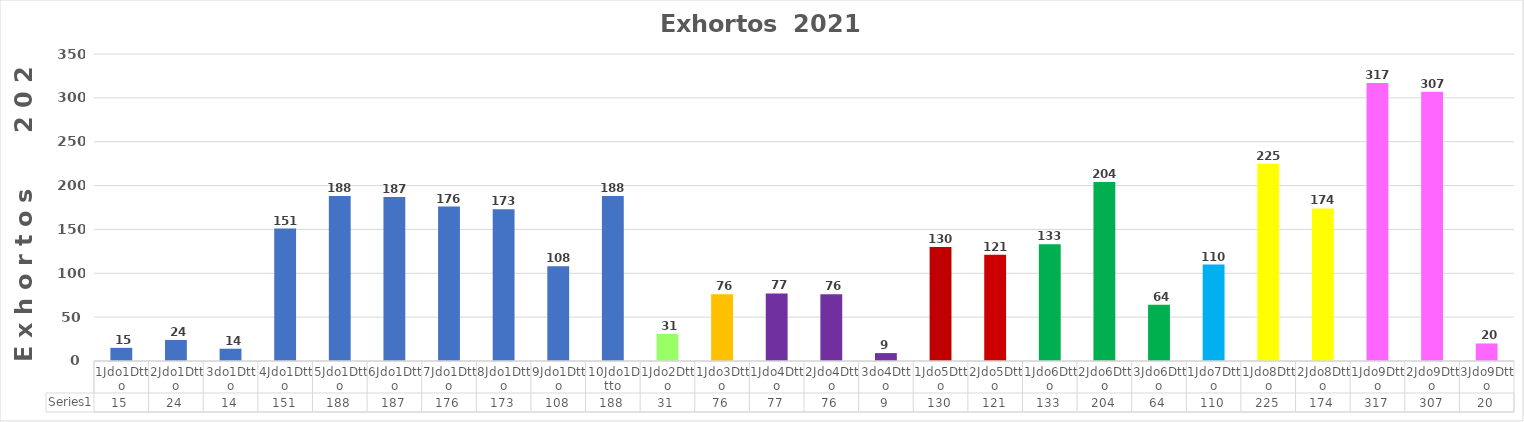
| Category | Series 0 |
|---|---|
| 1Jdo1Dtto | 15 |
| 2Jdo1Dtto | 24 |
| 3do1Dtto | 14 |
| 4Jdo1Dtto | 151 |
| 5Jdo1Dtto | 188 |
| 6Jdo1Dtto | 187 |
| 7Jdo1Dtto | 176 |
| 8Jdo1Dtto | 173 |
| 9Jdo1Dtto | 108 |
| 10Jdo1Dtto | 188 |
| 1Jdo2Dtto | 31 |
| 1Jdo3Dtto | 76 |
| 1Jdo4Dtto | 77 |
| 2Jdo4Dtto | 76 |
| 3do4Dtto | 9 |
| 1Jdo5Dtto | 130 |
| 2Jdo5Dtto | 121 |
| 1Jdo6Dtto | 133 |
| 2Jdo6Dtto | 204 |
| 3Jdo6Dtto | 64 |
| 1Jdo7Dtto | 110 |
| 1Jdo8Dtto | 225 |
| 2Jdo8Dtto | 174 |
| 1Jdo9Dtto | 317 |
| 2Jdo9Dtto | 307 |
| 3Jdo9Dtto | 20 |